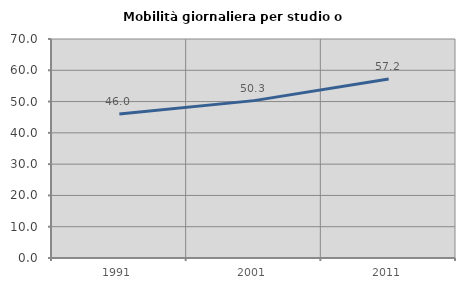
| Category | Mobilità giornaliera per studio o lavoro |
|---|---|
| 1991.0 | 45.997 |
| 2001.0 | 50.302 |
| 2011.0 | 57.205 |